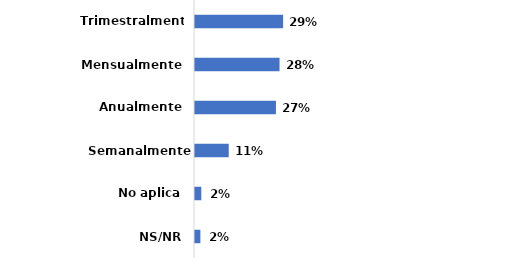
| Category | Series 0 |
|---|---|
| Trimestralmente | 0.295 |
| Mensualmente | 0.283 |
| Anualmente | 0.271 |
| Semanalmente | 0.113 |
| No aplica | 0.021 |
| NS/NR | 0.018 |